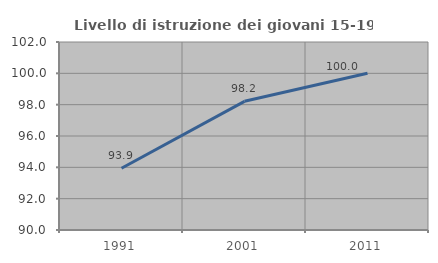
| Category | Livello di istruzione dei giovani 15-19 anni |
|---|---|
| 1991.0 | 93.939 |
| 2001.0 | 98.214 |
| 2011.0 | 100 |